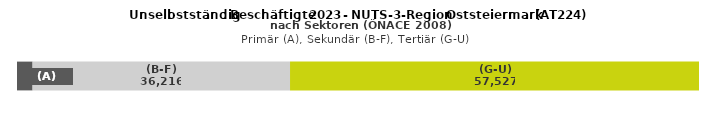
| Category | (A) | (B-F) | (G-U) |
|---|---|---|---|
| 0 | 2189 | 36216 | 57527 |